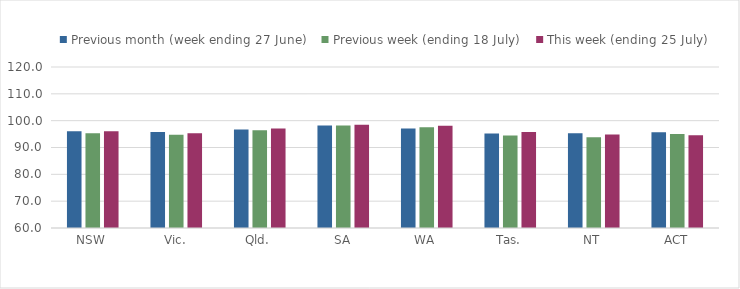
| Category | Previous month (week ending 27 June) | Previous week (ending 18 July) | This week (ending 25 July) |
|---|---|---|---|
| NSW | 96.091 | 95.329 | 96.056 |
| Vic. | 95.735 | 94.759 | 95.323 |
| Qld. | 96.714 | 96.443 | 97.072 |
| SA | 98.153 | 98.235 | 98.466 |
| WA | 97.057 | 97.574 | 98.125 |
| Tas. | 95.206 | 94.444 | 95.767 |
| NT | 95.325 | 93.78 | 94.827 |
| ACT | 95.728 | 95.054 | 94.526 |